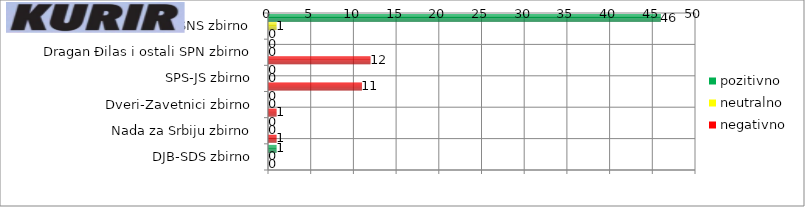
| Category | pozitivno | neutralno | negativno |
|---|---|---|---|
| Aleksandar Vučić i ostali SNS zbirno | 46 | 1 | 0 |
| Dragan Đilas i ostali SPN zbirno | 0 | 0 | 12 |
| SPS-JS zbirno | 0 | 0 | 11 |
| Dveri-Zavetnici zbirno | 0 | 0 | 1 |
| Nada za Srbiju zbirno | 0 | 0 | 1 |
| DJB-SDS zbirno | 1 | 0 | 0 |